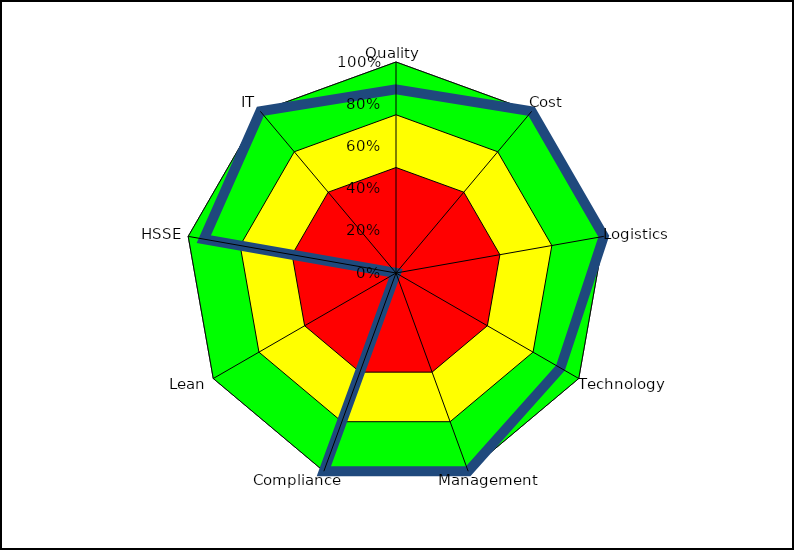
| Category | Series 0 | Series 1 | Series 2 | Series 3 |
|---|---|---|---|---|
| Quality | 1 | 0.75 | 0.5 | 0.87 |
| Cost | 1 | 0.75 | 0.5 | 1 |
| Logistics | 1 | 0.75 | 0.5 | 1 |
| Technology | 1 | 0.75 | 0.5 | 0.9 |
| Management | 1 | 0.75 | 0.5 | 1 |
| Compliance | 1 | 0.75 | 0.5 | 1 |
| Lean | 1 | 0.75 | 0.5 | 0 |
| HSSE | 1 | 0.75 | 0.5 | 0.925 |
| IT | 1 | 0.75 | 0.5 | 1 |